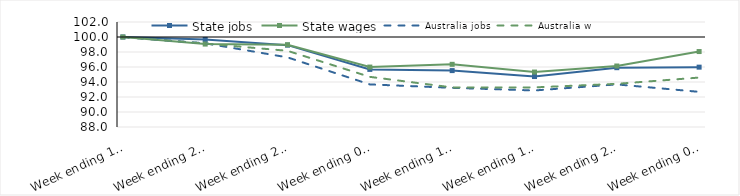
| Category | State jobs | State wages | Australia jobs | Australia wages |
|---|---|---|---|---|
| 2020-03-14 | 100 | 100 | 100 | 100 |
| 2020-03-21 | 99.674 | 99.057 | 99.165 | 99.123 |
| 2020-03-28 | 98.916 | 98.968 | 97.282 | 98.156 |
| 2020-04-04 | 95.68 | 95.991 | 93.679 | 94.686 |
| 2020-04-11 | 95.52 | 96.358 | 93.222 | 93.277 |
| 2020-04-18 | 94.729 | 95.324 | 92.871 | 93.281 |
| 2020-04-25 | 95.908 | 96.132 | 93.679 | 93.754 |
| 2020-05-02 | 95.98 | 98.06 | 92.686 | 94.591 |